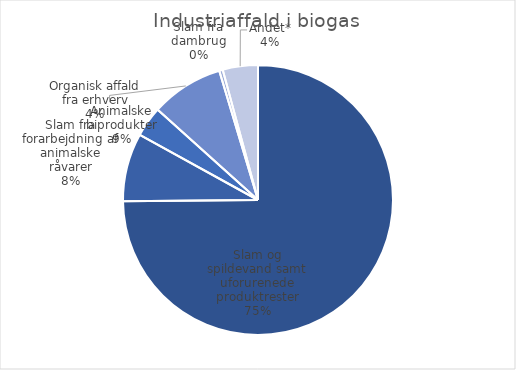
| Category | Series 0 |
|---|---|
| Slam og spildevand samt uforurenede produktrester | 2537289.61 |
| Slam fra forarbejdning af animalske råvarer | 277257.5 |
| Organisk affald fra erhverv | 123327.37 |
| Animalske biprodukter | 294869.82 |
| Slam fra dambrug | 14374 |
| Andet* | 142808.2 |